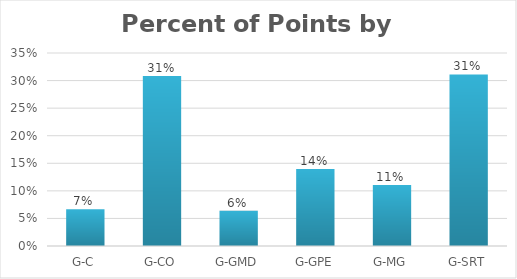
| Category | Percent |
|---|---|
| G-C | 0.067 |
| G-CO | 0.308 |
| G-GMD | 0.064 |
| G-GPE | 0.14 |
| G-MG | 0.11 |
| G-SRT | 0.311 |